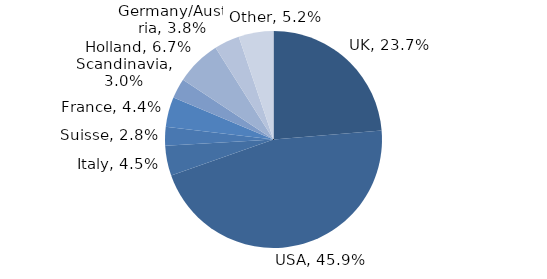
| Category | Investment Style |
|---|---|
| UK | 0.237 |
| USA | 0.459 |
| Italy | 0.045 |
| Suisse | 0.028 |
| France | 0.044 |
| Scandinavia | 0.03 |
| Holland | 0.067 |
| Germany/Austria | 0.038 |
| Other | 0.052 |